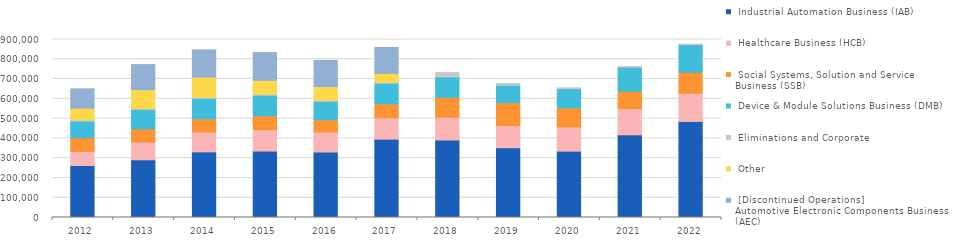
| Category |  Industrial Automation Business (IAB) |  Healthcare Business (HCB) |  Social Systems, Solution and Service Business (SSB) |  Device & Module Solutions Business (DMB) |  Eliminations and Corporate |  Other |  [Discontinued Operations] 
Automotive Electronic Components Business (AEC) |
|---|---|---|---|---|---|---|---|
| 2012.0 | 262983 | 71520 | 68754 | 84107 | 6214 | 59240 | 97643 |
| 2013.0 | 291739 | 89275 | 67575 | 97699 | 5989 | 94069 | 126620 |
| 2014.0 | 331840 | 100615 | 66419 | 103946 | 5176 | 101373 | 137883 |
| 2015.0 | 335959 | 108121 | 70378 | 103681 | 5311 | 70188 | 139966 |
| 2016.0 | 330959 | 101295 | 61883 | 93938 | 5557 | 68510 | 132060 |
| 2017.0 | 396140 | 108489 | 70289 | 104362 | 5173 | 44377 | 131152 |
| 2018.0 | 391826 | 115493 | 100564 | 103123 | 21575 | 0 | 0 |
| 2019.0 | 352762 | 111999 | 116008 | 88357 | 8854 | 0 | 0 |
| 2020.0 | 335621 | 123087 | 95663 | 96853 | 4305 | 0 | 0 |
| 2021.0 | 418107 | 132857 | 87692 | 120972 | 3299 | 0 | 0 |
| 2022.0 | 485738 | 142132 | 107273 | 138854 | 2085 | 0 | 0 |